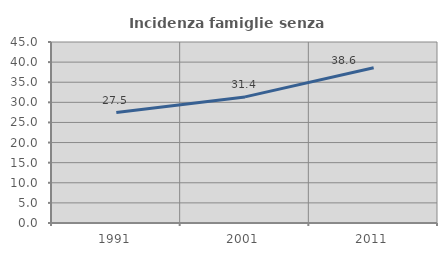
| Category | Incidenza famiglie senza nuclei |
|---|---|
| 1991.0 | 27.463 |
| 2001.0 | 31.352 |
| 2011.0 | 38.579 |